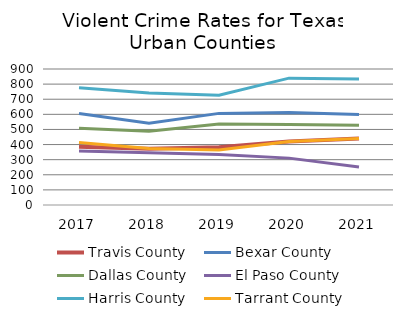
| Category | Travis County | Bexar County | Dallas County | El Paso County | Harris County | Tarrant County |
|---|---|---|---|---|---|---|
| 2017.0 | 385.511 | 605.894 | 508.675 | 357.81 | 776.422 | 412.975 |
| 2018.0 | 371.5 | 540.98 | 488.02 | 345.84 | 740.79 | 374.01 |
| 2019.0 | 381.615 | 606.276 | 535.34 | 333.483 | 726.811 | 363.622 |
| 2020.0 | 419.544 | 611.741 | 531.907 | 310.194 | 839.464 | 420.524 |
| 2021.0 | 439.802 | 598.851 | 528.442 | 250.735 | 834.173 | 440.604 |